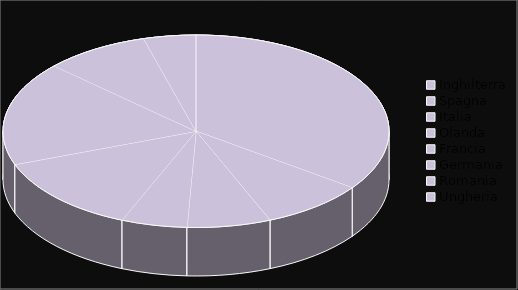
| Category | Series 0 |
|---|---|
| Inghilterra | 4000000 |
| Spagna | 1000000 |
| Italia | 800000 |
| Olanda | 630000 |
| Francia | 1500000 |
| Germania | 2000000 |
| Romania  | 1000000 |
| Ungheria | 500000 |